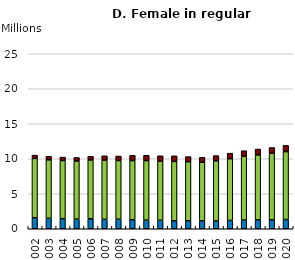
| Category | Under 25 | 25-60  | Over 60 |
|---|---|---|---|
| 2002.0 | 1.58 | 8.47 | 0.47 |
| 2003.0 | 1.49 | 8.36 | 0.5 |
| 2004.0 | 1.44 | 8.31 | 0.49 |
| 2005.0 | 1.38 | 8.3 | 0.5 |
| 2006.0 | 1.43 | 8.4 | 0.53 |
| 2007.0 | 1.35 | 8.46 | 0.61 |
| 2008.0 | 1.36 | 8.39 | 0.64 |
| 2009.0 | 1.29 | 8.45 | 0.75 |
| 2010.0 | 1.23 | 8.51 | 0.76 |
| 2011.0 | 1.21 | 8.45 | 0.77 |
| 2012.0 | 1.14 | 8.48 | 0.8 |
| 2013.0 | 1.13 | 8.44 | 0.74 |
| 2014.0 | 1.12 | 8.38 | 0.71 |
| 2015.0 | 1.12 | 8.59 | 0.74 |
| 2016.0 | 1.19 | 8.82 | 0.79 |
| 2017.0 | 1.24 | 9.11 | 0.8 |
| 2018.0 | 1.27 | 9.28 | 0.84 |
| 2019.0 | 1.29 | 9.49 | 0.83 |
| 2020.0 | 1.32 | 9.7 | 0.89 |